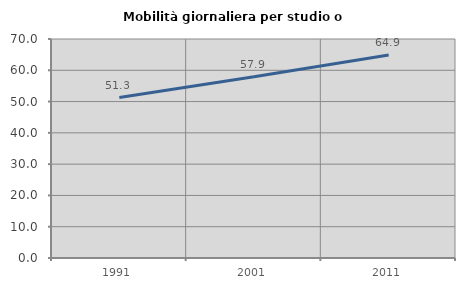
| Category | Mobilità giornaliera per studio o lavoro |
|---|---|
| 1991.0 | 51.273 |
| 2001.0 | 57.905 |
| 2011.0 | 64.88 |